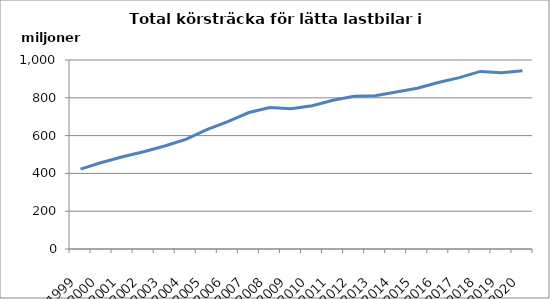
| Category | Series 0 |
|---|---|
| 1999.0 | 422257663.4 |
| 2000.0 | 457395257.8 |
| 2001.0 | 488193162.8 |
| 2002.0 | 514755393.5 |
| 2003.0 | 545141383.5 |
| 2004.0 | 580338676.2 |
| 2005.0 | 631604271.8 |
| 2006.0 | 674180412.5 |
| 2007.0 | 722000073.4 |
| 2008.0 | 748186336.2 |
| 2009.0 | 742110599.7 |
| 2010.0 | 757725514.2 |
| 2011.0 | 787023975 |
| 2012.0 | 808048451 |
| 2013.0 | 810917728 |
| 2014.0 | 830330963.4 |
| 2015.0 | 850273283.5 |
| 2016.0 | 880672465.6 |
| 2017.0 | 906673343.6 |
| 2018.0 | 939618081 |
| 2019.0 | 932735513 |
| 2020.0 | 943099242.2 |